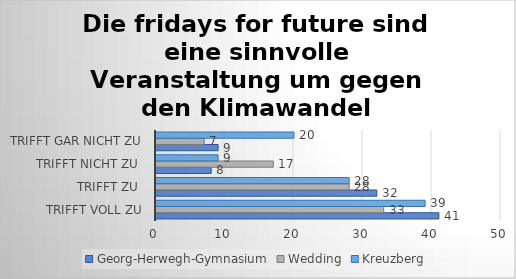
| Category | Georg-Herwegh-Gymnasium | Wedding | Kreuzberg |
|---|---|---|---|
| trifft voll zu | 41 | 33 | 39 |
| trifft zu  | 32 | 28 | 28 |
| trifft nicht zu  | 8 | 17 | 9 |
| trifft gar nicht zu | 9 | 7 | 20 |